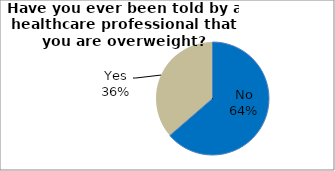
| Category | Series 0 |
|---|---|
| No | 63.618 |
| Yes | 36.382 |